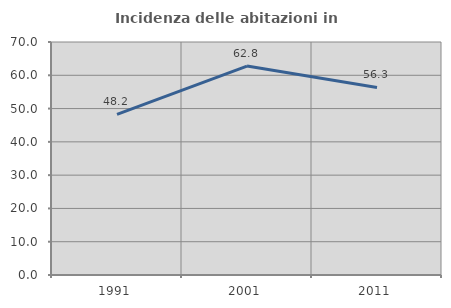
| Category | Incidenza delle abitazioni in proprietà  |
|---|---|
| 1991.0 | 48.241 |
| 2001.0 | 62.771 |
| 2011.0 | 56.349 |